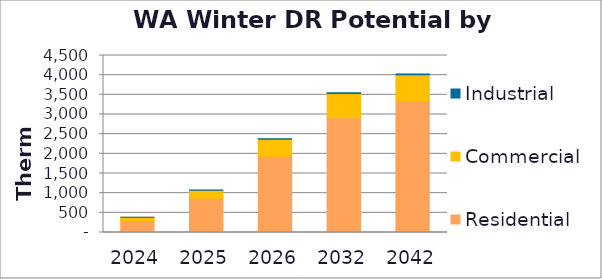
| Category |  Residential  | Commercial | Industrial |
|---|---|---|---|
| 2024.0 | 307.585 | 77.895 | 3.281 |
| 2025.0 | 870.66 | 204.966 | 7.18 |
| 2026.0 | 1935.747 | 434.597 | 13.269 |
| 2032.0 | 2918.739 | 615.569 | 18.265 |
| 2042.0 | 3337.362 | 670.946 | 21.944 |